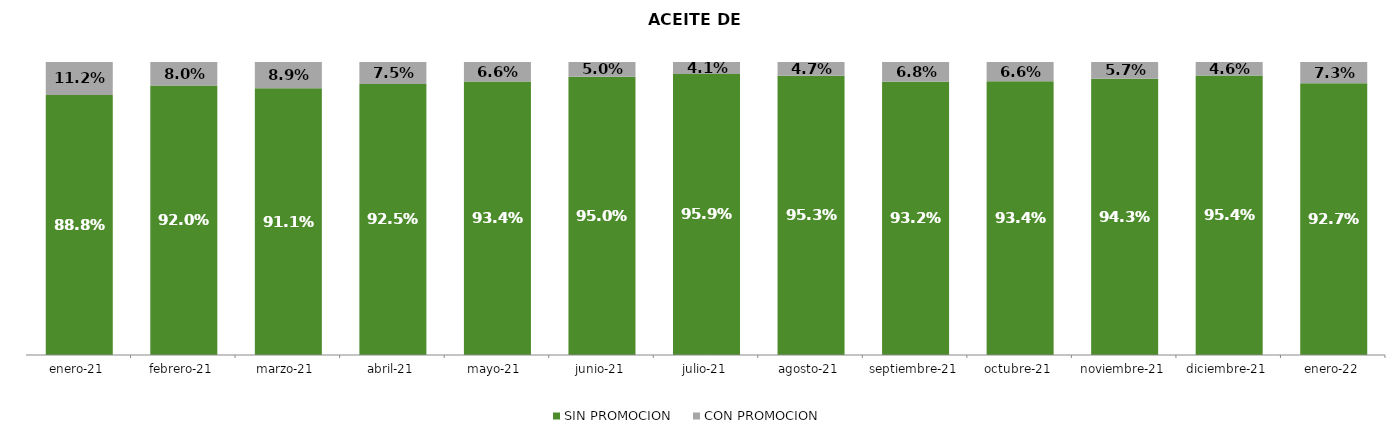
| Category | SIN PROMOCION   | CON PROMOCION   |
|---|---|---|
| 2021-01-01 | 0.888 | 0.112 |
| 2021-02-01 | 0.92 | 0.08 |
| 2021-03-01 | 0.911 | 0.089 |
| 2021-04-01 | 0.925 | 0.075 |
| 2021-05-01 | 0.934 | 0.066 |
| 2021-06-01 | 0.95 | 0.05 |
| 2021-07-01 | 0.959 | 0.041 |
| 2021-08-01 | 0.953 | 0.047 |
| 2021-09-01 | 0.932 | 0.068 |
| 2021-10-01 | 0.934 | 0.066 |
| 2021-11-01 | 0.943 | 0.057 |
| 2021-12-01 | 0.954 | 0.046 |
| 2022-01-01 | 0.927 | 0.073 |